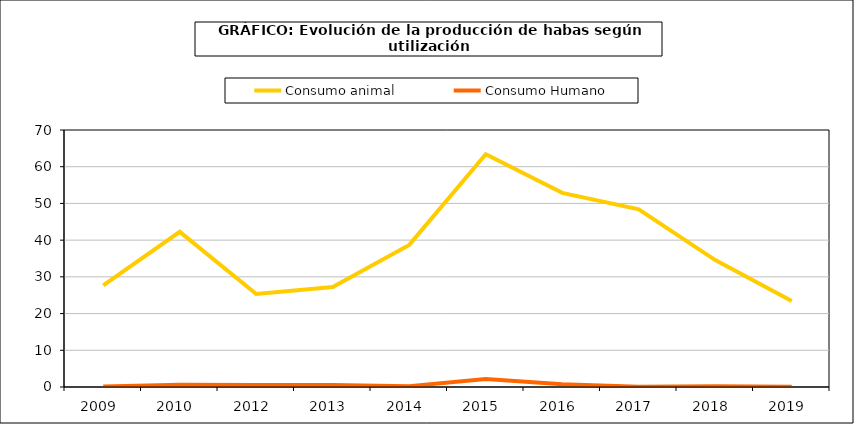
| Category | Consumo animal | Consumo Humano |
|---|---|---|
| 2009  | 27.701 | 0.165 |
| 2010  | 42.262 | 0.62 |
| 2012  | 25.317 | 0.571 |
| 2013  | 27.212 | 0.547 |
| 2014  | 38.703 | 0.238 |
| 2015  | 63.379 | 2.153 |
| 2016  | 52.865 | 0.76 |
| 2017  | 48.372 | 0.096 |
| 2018  | 34.561 | 0.189 |
| 2019  | 23.41 | 0.082 |